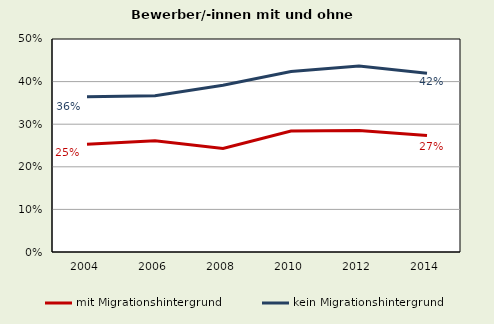
| Category | mit Migrationshintergrund | kein Migrationshintergrund |
|---|---|---|
| 2004.0 | 0.253 | 0.365 |
| 2006.0 | 0.261 | 0.367 |
| 2008.0 | 0.243 | 0.391 |
| 2010.0 | 0.284 | 0.424 |
| 2012.0 | 0.285 | 0.437 |
| 2014.0 | 0.273 | 0.42 |